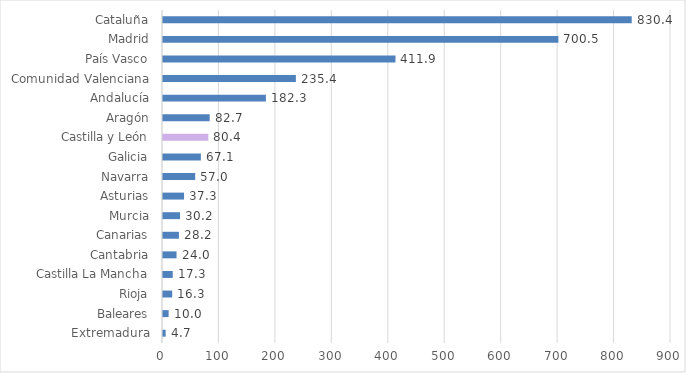
| Category | Series 0 |
|---|---|
| Extremadura | 4.7 |
| Baleares | 10 |
| Rioja | 16.3 |
| Castilla La Mancha | 17.3 |
| Cantabria | 24 |
| Canarias | 28.2 |
| Murcia | 30.2 |
| Asturias | 37.3 |
| Navarra | 57 |
| Galicia | 67.1 |
| Castilla y León | 80.4 |
| Aragón | 82.7 |
| Andalucía | 182.3 |
| Comunidad Valenciana | 235.4 |
| País Vasco | 411.9 |
| Madrid | 700.5 |
| Cataluña | 830.4 |